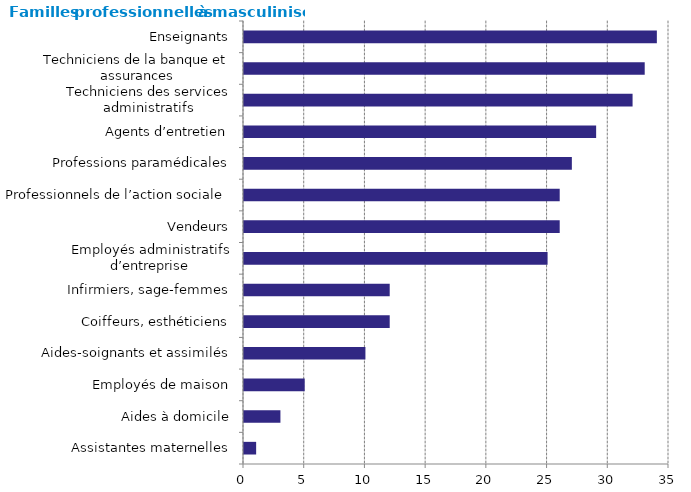
| Category | Series 0 |
|---|---|
| Assistantes maternelles | 1 |
| Aides à domicile | 3 |
| Employés de maison | 5 |
| Aides-soignants et assimilés | 10 |
| Coiffeurs, esthéticiens | 12 |
| Infirmiers, sage-femmes | 12 |
| Employés administratifs d’entreprise | 25 |
| Vendeurs | 26 |
| Professionnels de l’action sociale  | 26 |
| Professions paramédicales | 27 |
| Agents d’entretien | 29 |
| Techniciens des services administratifs | 32 |
| Techniciens de la banque et assurances | 33 |
| Enseignants | 34 |